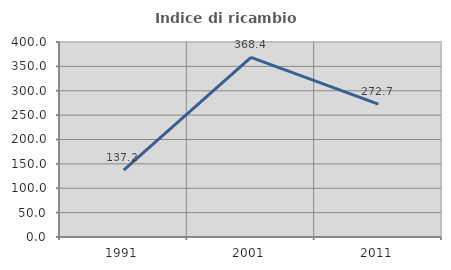
| Category | Indice di ricambio occupazionale  |
|---|---|
| 1991.0 | 137.209 |
| 2001.0 | 368.421 |
| 2011.0 | 272.727 |